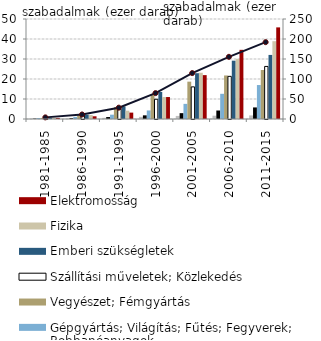
| Category | Textilipar; Papírgyártás | Építőipar | Gépgyártás; Világítás; Fűtés; Fegyverek; Robbanóanyagok | Vegyészet; Fémgyártás | Szállítási műveletek; Közlekedés | Emberi szükségletek | Fizika | Elektromosság |
|---|---|---|---|---|---|---|---|---|
| 1981-1985 | 68.728 | 204.494 | 463.384 | 529.632 | 857.363 | 669.728 | 713.135 | 549.936 |
| 1986-1990 | 216.247 | 444.395 | 1059.715 | 1933.597 | 2249.103 | 2097.34 | 1979.662 | 1357.34 |
| 1991-1995 | 584.351 | 979.151 | 2154.728 | 5998.68 | 4967.408 | 6277.393 | 4160.336 | 3193.952 |
| 1996-2000 | 1078.228 | 1831.313 | 4268.768 | 12160.94 | 9879.131 | 13536.269 | 10973.443 | 10982.306 |
| 2001-2005 | 1537.828 | 2919.72 | 7566.337 | 18674.043 | 16054.79 | 22896.45 | 23124.889 | 21938.344 |
| 2006-2010 | 1651.841 | 4242.746 | 12599.912 | 21764.938 | 21326.374 | 29167.379 | 30057.829 | 34585.981 |
| 2011-2015 | 1793.659 | 5782.58 | 16982.849 | 24502.679 | 26286.448 | 32038.37 | 38903.791 | 45806.224 |